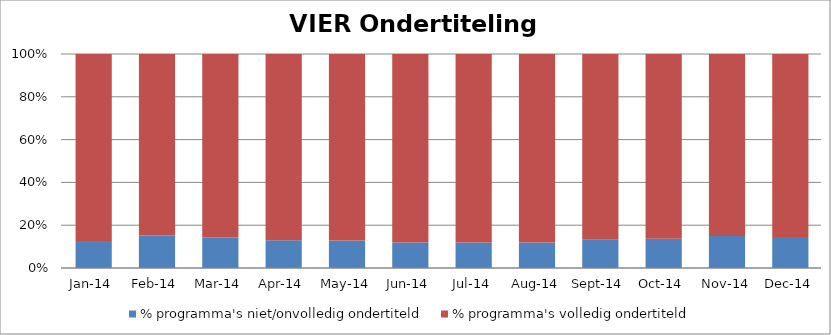
| Category | % programma's niet/onvolledig ondertiteld | % programma's volledig ondertiteld |
|---|---|---|
| 2014-01-01 | 0.126 | 0.874 |
| 2014-02-01 | 0.152 | 0.848 |
| 2014-03-01 | 0.143 | 0.857 |
| 2014-04-01 | 0.129 | 0.871 |
| 2014-05-01 | 0.129 | 0.871 |
| 2014-06-01 | 0.119 | 0.881 |
| 2014-07-01 | 0.12 | 0.88 |
| 2014-08-01 | 0.119 | 0.881 |
| 2014-09-01 | 0.132 | 0.868 |
| 2014-10-01 | 0.137 | 0.863 |
| 2014-11-01 | 0.15 | 0.85 |
| 2014-12-01 | 0.145 | 0.855 |